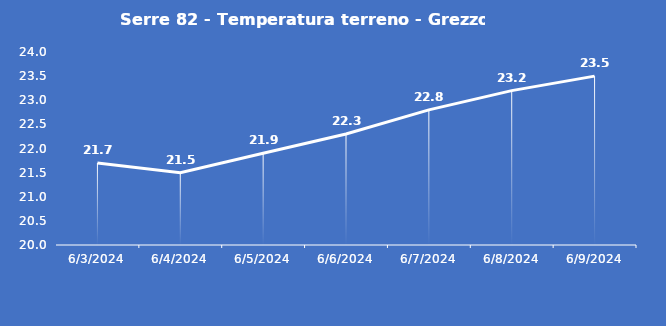
| Category | Serre 82 - Temperatura terreno - Grezzo (°C) |
|---|---|
| 6/3/24 | 21.7 |
| 6/4/24 | 21.5 |
| 6/5/24 | 21.9 |
| 6/6/24 | 22.3 |
| 6/7/24 | 22.8 |
| 6/8/24 | 23.2 |
| 6/9/24 | 23.5 |